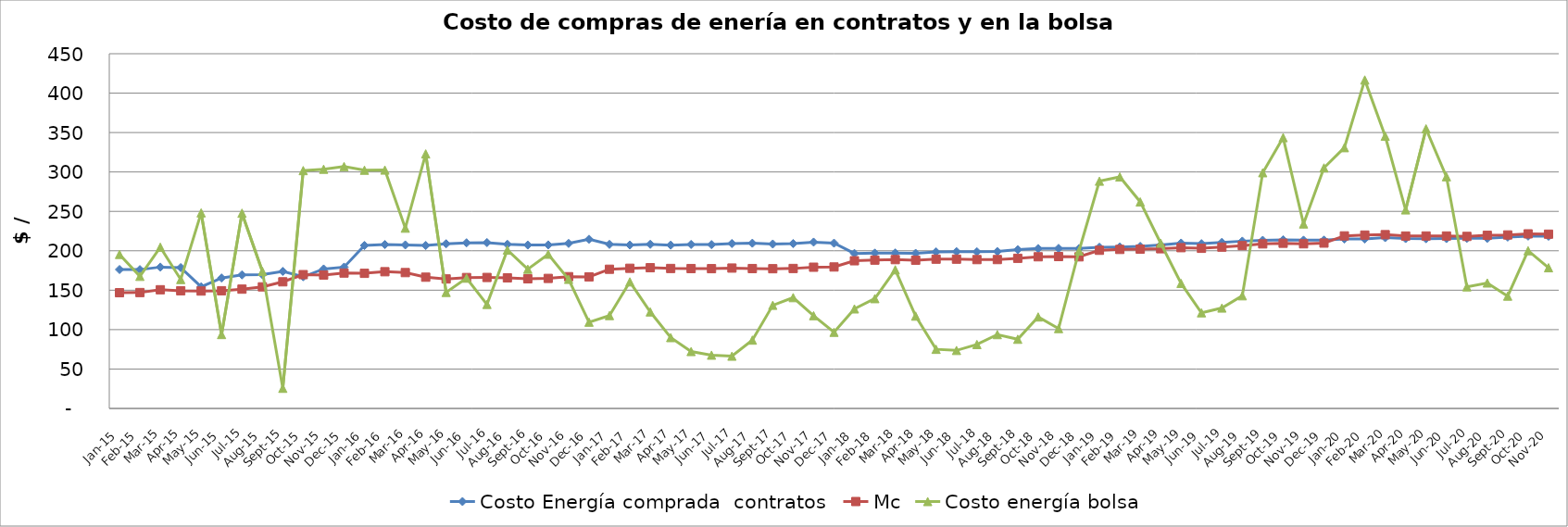
| Category | Costo Energía comprada  contratos | Mc | Costo energía bolsa |
|---|---|---|---|
| 2015-01-01 | 176.256 | 146.843 | 195.431 |
| 2015-02-01 | 176.098 | 147.022 | 167.606 |
| 2015-03-01 | 179.319 | 150.581 | 204.605 |
| 2015-04-01 | 178.706 | 149.297 | 163.582 |
| 2015-05-01 | 154.316 | 148.958 | 248.122 |
| 2015-06-01 | 165.483 | 149.312 | 93.809 |
| 2015-07-01 | 169.438 | 151.362 | 247.741 |
| 2015-08-01 | 169.755 | 154.234 | 173.959 |
| 2015-09-01 | 173.818 | 160.65 | 25.576 |
| 2015-10-01 | 167.076 | 169.742 | 301.77 |
| 2015-11-01 | 176.913 | 169.261 | 303.466 |
| 2015-12-01 | 179.259 | 171.768 | 306.914 |
| 2016-01-01 | 206.723 | 171.419 | 302.251 |
| 2016-02-01 | 207.902 | 173.454 | 302.431 |
| 2016-03-01 | 207.44 | 172.363 | 228.744 |
| 2016-04-01 | 206.728 | 166.514 | 322.955 |
| 2016-05-01 | 208.884 | 164.299 | 147.221 |
| 2016-06-01 | 210.082 | 166.058 | 165.319 |
| 2016-07-01 | 210.369 | 166.162 | 132.027 |
| 2016-08-01 | 208.187 | 165.698 | 200.999 |
| 2016-09-01 | 207.292 | 164.468 | 176.677 |
| 2016-10-01 | 207.481 | 164.959 | 195.663 |
| 2016-11-01 | 209.37 | 167.167 | 163.825 |
| 2016-12-01 | 214.653 | 166.933 | 109.457 |
| 2017-01-01 | 208.177 | 176.587 | 117.869 |
| 2017-02-01 | 207.335 | 177.81 | 160.596 |
| 2017-03-01 | 208.249 | 178.537 | 122.456 |
| 2017-04-01 | 207.212 | 177.575 | 89.895 |
| 2017-05-01 | 208.042 | 177.464 | 72.206 |
| 2017-06-01 | 207.842 | 177.342 | 67.639 |
| 2017-07-01 | 209.192 | 178.089 | 66.338 |
| 2017-08-01 | 209.622 | 177.465 | 86.711 |
| 2017-09-01 | 208.584 | 177.254 | 130.88 |
| 2017-10-01 | 209.182 | 177.563 | 140.614 |
| 2017-11-01 | 210.975 | 179.168 | 117.686 |
| 2017-12-01 | 209.693 | 179.459 | 96.628 |
| 2018-01-01 | 196.588 | 187.363 | 126.321 |
| 2018-02-01 | 197.04 | 188.168 | 139.304 |
| 2018-03-01 | 197.228 | 188.798 | 175.874 |
| 2018-04-01 | 196.799 | 188.079 | 117.161 |
| 2018-05-01 | 198.584 | 189.378 | 75.043 |
| 2018-06-01 | 198.946 | 189.377 | 73.602 |
| 2018-07-01 | 198.741 | 188.836 | 81.14 |
| 2018-08-01 | 199.072 | 188.875 | 93.705 |
| 2018-09-01 | 201.433 | 190.467 | 87.801 |
| 2018-10-01 | 202.872 | 192.41 | 116.077 |
| 2018-11-01 | 203.027 | 192.676 | 101.339 |
| 2018-12-01 | 202.828 | 192.334 | 199.764 |
| 2019-01-01 | 204.506 | 200.635 | 288.315 |
| 2019-02-01 | 204.856 | 201.734 | 293.757 |
| 2019-03-01 | 205.576 | 202.141 | 262.083 |
| 2019-04-01 | 207.382 | 202.585 | 209.704 |
| 2019-05-01 | 209.763 | 203.972 | 158.679 |
| 2019-06-01 | 209.007 | 203.156 | 121.33 |
| 2019-07-01 | 210.703 | 204.667 | 127.384 |
| 2019-08-01 | 212.222 | 206.59 | 142.954 |
| 2019-09-01 | 213.319 | 208.756 | 299.03 |
| 2019-10-01 | 213.898 | 209.562 | 343.534 |
| 2019-11-01 | 213.46 | 208.881 | 234.067 |
| 2019-12-01 | 213.546 | 209.776 | 305.157 |
| 2020-01-01 | 215.031 | 218.896 | 330.852 |
| 2020-02-01 | 215.03 | 219.931 | 416.661 |
| 2020-03-01 | 216.665 | 220.458 | 345.386 |
| 2020-04-01 | 215.467 | 218.707 | 251.91 |
| 2020-05-01 | 215.31 | 218.769 | 354.744 |
| 2020-06-01 | 215.47 | 218.749 | 293.936 |
| 2020-07-01 | 215.763 | 218.24 | 154.269 |
| 2020-08-01 | 215.763 | 219.631 | 159.196 |
| 2020-09-01 | 217.417 | 220.065 | 142.508 |
| 2020-10-01 | 218.682 | 221.486 | 200.092 |
| 2020-11-01 | 218.493 | 221.081 | 178.521 |